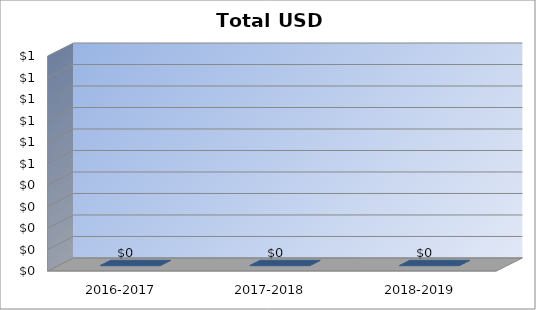
| Category | Total USD Debt |
|---|---|
| 2016-2017 | 0 |
| 2017-2018 | 0 |
| 2018-2019 | 0 |